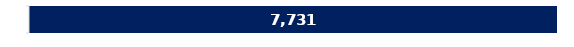
| Category | Potential Demand |
|---|---|
| 0 | 7730.854 |